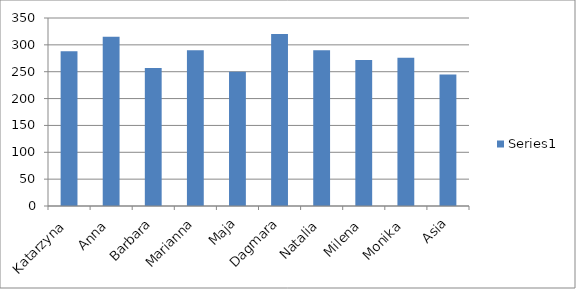
| Category | Series 0 |
|---|---|
| Katarzyna | 288 |
| Anna | 315 |
| Barbara | 257 |
| Marianna | 290 |
| Maja | 250 |
| Dagmara | 320 |
| Natalia | 290 |
| Milena | 272 |
| Monika | 276 |
| Asia | 245 |